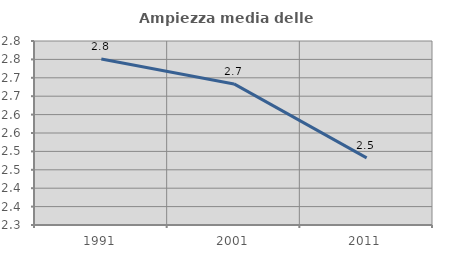
| Category | Ampiezza media delle famiglie |
|---|---|
| 1991.0 | 2.751 |
| 2001.0 | 2.683 |
| 2011.0 | 2.482 |